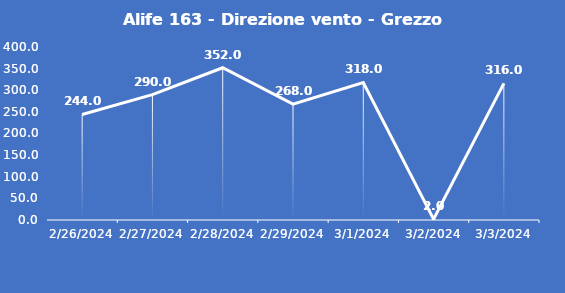
| Category | Alife 163 - Direzione vento - Grezzo (°N) |
|---|---|
| 2/26/24 | 244 |
| 2/27/24 | 290 |
| 2/28/24 | 352 |
| 2/29/24 | 268 |
| 3/1/24 | 318 |
| 3/2/24 | 2 |
| 3/3/24 | 316 |